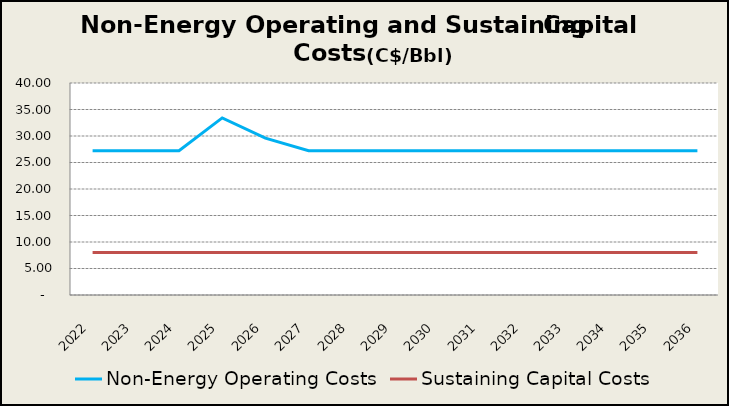
| Category | Non-Energy Operating Costs  | Sustaining Capital Costs |
|---|---|---|
| 2022.0 | 27.219 | 8 |
| 2023.0 | 27.219 | 8 |
| 2024.0 | 27.219 | 8 |
| 2025.0 | 33.42 | 8 |
| 2026.0 | 29.608 | 8 |
| 2027.0 | 27.219 | 8 |
| 2028.0 | 27.219 | 8 |
| 2029.0 | 27.219 | 8 |
| 2030.0 | 27.219 | 8 |
| 2031.0 | 27.219 | 8 |
| 2032.0 | 27.219 | 8 |
| 2033.0 | 27.219 | 8 |
| 2034.0 | 27.219 | 8 |
| 2035.0 | 27.219 | 8 |
| 2036.0 | 27.219 | 8 |